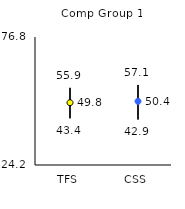
| Category | 25th | 75th | Mean |
|---|---|---|---|
| TFS | 43.4 | 55.9 | 49.81 |
| CSS | 42.9 | 57.1 | 50.36 |